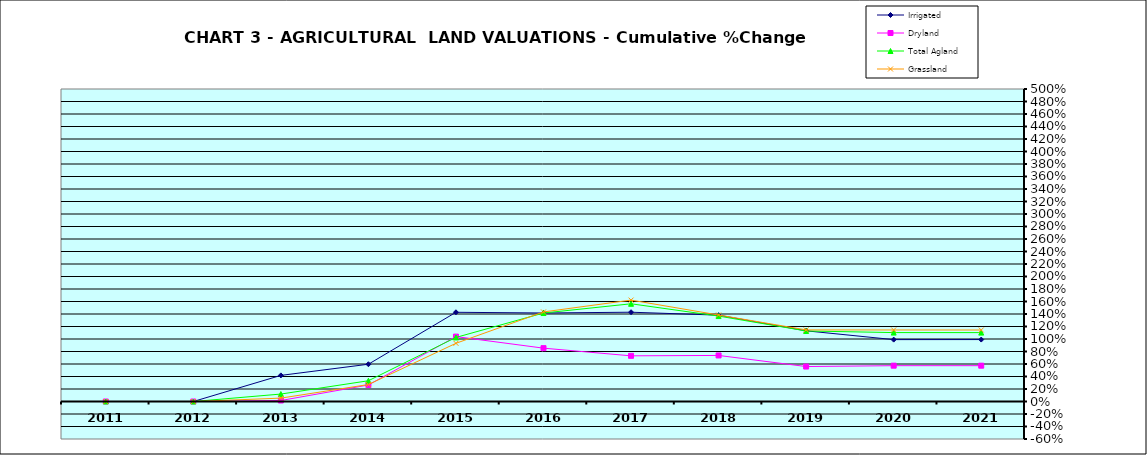
| Category | Irrigated | Dryland | Total Agland | Grassland |
|---|---|---|---|---|
| 2011.0 | 0 | 0 | 0 | 0 |
| 2012.0 | 0 | 0 | 0 | -0.001 |
| 2013.0 | 0.418 | 0.016 | 0.119 | 0.054 |
| 2014.0 | 0.596 | 0.264 | 0.332 | 0.272 |
| 2015.0 | 1.427 | 1.038 | 1.025 | 0.931 |
| 2016.0 | 1.416 | 0.853 | 1.416 | 1.433 |
| 2017.0 | 1.429 | 0.731 | 1.563 | 1.622 |
| 2018.0 | 1.382 | 0.737 | 1.367 | 1.384 |
| 2019.0 | 1.131 | 0.559 | 1.128 | 1.146 |
| 2020.0 | 0.99 | 0.573 | 1.103 | 1.145 |
| 2021.0 | 0.991 | 0.573 | 1.102 | 1.144 |